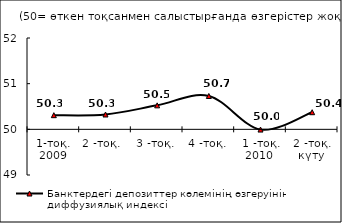
| Category | Банктердегі депозиттер көлемінің өзгеруінің диффузиялық индексі |
|---|---|
| 1-тоқ. 2009 | 50.31 |
| 2 -тоқ.  | 50.325 |
| 3 -тоқ. | 50.525 |
| 4 -тоқ. | 50.73 |
| 1 -тоқ. 2010  | 49.995 |
| 2 -тоқ. күту | 50.375 |